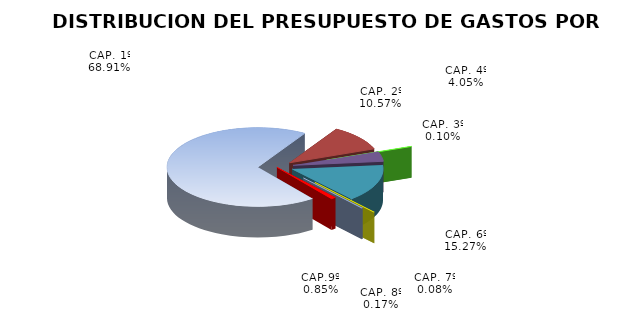
| Category | Series 1 | Año 2017 |
|---|---|---|
| CAP. 1º | 269404548.06 |  |
| CAP. 2º | 41337458.851 |  |
| CAP. 3º | 400000 |  |
| CAP. 4º | 15830728.03 |  |
| CAP. 6º | 59695290.501 |  |
| CAP. 7º | 318213 |  |
| CAP. 8º | 650000 |  |
| CAP.9º | 3314121.56 |  |